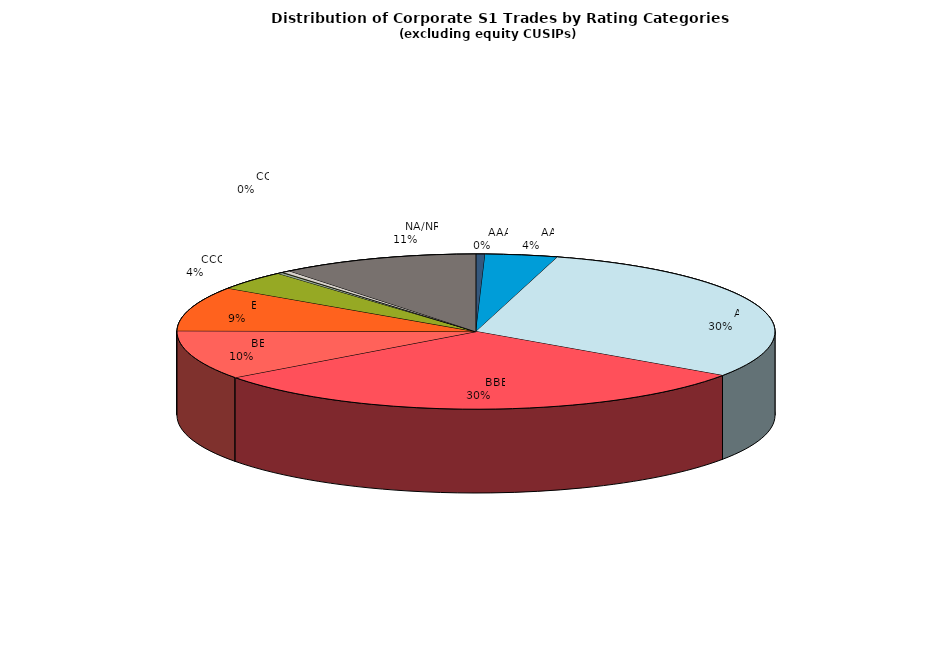
| Category | Series 0 |
|---|---|
|         AAA | 215.645 |
|         AA | 1719.287 |
|         A | 13277.956 |
|         BBB | 13346.785 |
|         BB | 4516.924 |
|         B | 4081.542 |
|         CCC | 1779.024 |
|         CC | 120.681 |
|         C | 30.916 |
|         D | 193.661 |
|         NA/NR | 4717.159 |